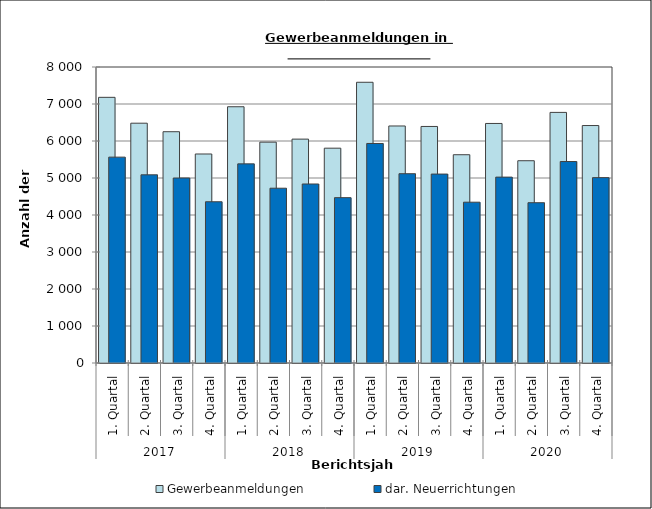
| Category | Gewerbeanmeldungen | dar. Neuerrichtungen |
|---|---|---|
| 0 | 7180 | 5564 |
| 1 | 6481 | 5086 |
| 2 | 6251 | 5000 |
| 3 | 5649 | 4358 |
| 4 | 6926 | 5382 |
| 5 | 5969 | 4724 |
| 6 | 6051 | 4838 |
| 7 | 5806 | 4469 |
| 8 | 7587 | 5933 |
| 9 | 6406 | 5116 |
| 10 | 6393 | 5106 |
| 11 | 5629 | 4346 |
| 12 | 6474 | 5024 |
| 13 | 5467 | 4332 |
| 14 | 6773 | 5445 |
| 15 | 6418 | 5010 |